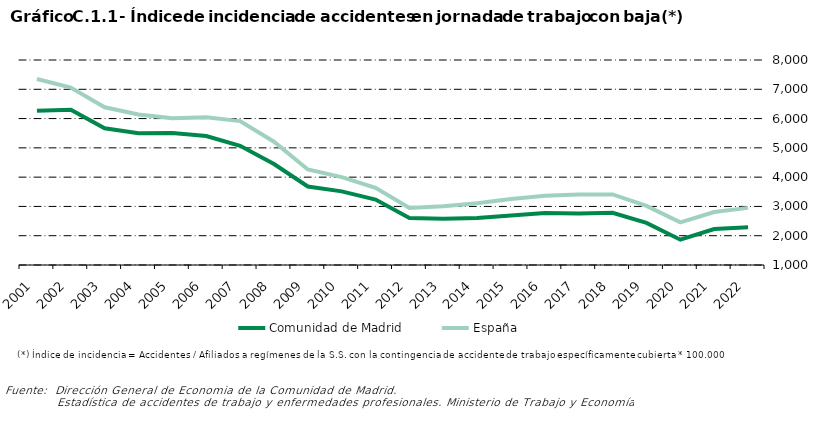
| Category | Comunidad de Madrid | España |
|---|---|---|
| 2001.0 | 6263.812 | 7349.906 |
| 2002.0 | 6301.191 | 7057.188 |
| 2003.0 | 5668.511 | 6386.686 |
| 2004.0 | 5499.328 | 6136.386 |
| 2005.0 | 5505.664 | 6011.816 |
| 2006.0 | 5403.6 | 6047.6 |
| 2007.0 | 5069.1 | 5914.3 |
| 2008.0 | 4446.967 | 5210.821 |
| 2009.0 | 3681.016 | 4263.424 |
| 2010.0 | 3513.805 | 4000.06 |
| 2011.0 | 3234.665 | 3633.764 |
| 2012.0 | 2604.886 | 2948.946 |
| 2013.0 | 2575.348 | 3009.214 |
| 2014.0 | 2602.73 | 3111.3 |
| 2015.0 | 2688.053 | 3252.005 |
| 2016.0 | 2778.158 | 3364.042 |
| 2017.0 | 2757.499 | 3408.761 |
| 2018.0 | 2784.151 | 3408.696 |
| 2019.0 | 2437.119 | 3019.64 |
| 2020.0 | 1863.51 | 2455.099 |
| 2021.0 | 2228.974 | 2810.488 |
| 2022.0 | 2286.452 | 2950.743 |